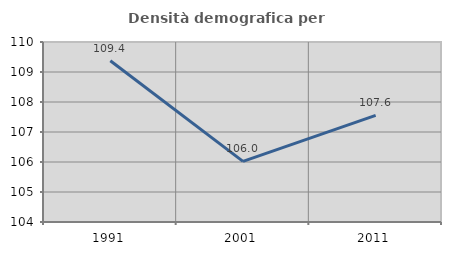
| Category | Densità demografica |
|---|---|
| 1991.0 | 109.374 |
| 2001.0 | 106.02 |
| 2011.0 | 107.555 |